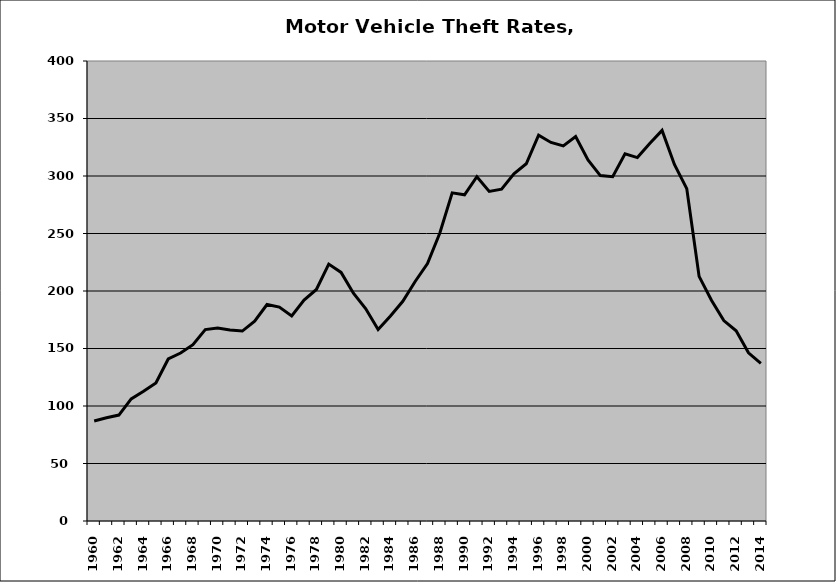
| Category | Motor Vehicle |
|---|---|
| 1960.0 | 86.937 |
| 1961.0 | 89.792 |
| 1962.0 | 92.116 |
| 1963.0 | 106.134 |
| 1964.0 | 112.819 |
| 1965.0 | 119.984 |
| 1966.0 | 140.88 |
| 1967.0 | 146.053 |
| 1968.0 | 153.32 |
| 1969.0 | 166.475 |
| 1970.0 | 167.806 |
| 1971.0 | 166.071 |
| 1972.0 | 165.171 |
| 1973.0 | 173.772 |
| 1974.0 | 188.271 |
| 1975.0 | 186.003 |
| 1976.0 | 178.278 |
| 1977.0 | 192.072 |
| 1978.0 | 201.327 |
| 1979.0 | 223.386 |
| 1980.0 | 216.149 |
| 1981.0 | 198.084 |
| 1982.0 | 184.499 |
| 1983.0 | 166.458 |
| 1984.0 | 178.264 |
| 1985.0 | 191.047 |
| 1986.0 | 208.277 |
| 1987.0 | 223.795 |
| 1988.0 | 250.383 |
| 1989.0 | 285.314 |
| 1990.0 | 283.663 |
| 1991.0 | 299.347 |
| 1992.0 | 286.614 |
| 1993.0 | 288.495 |
| 1994.0 | 301.867 |
| 1995.0 | 310.632 |
| 1996.0 | 335.464 |
| 1997.0 | 329.185 |
| 1998.0 | 326.213 |
| 1999.0 | 334.305 |
| 2000.0 | 313.89 |
| 2001.0 | 300.35 |
| 2002.0 | 299.38 |
| 2003.0 | 319.337 |
| 2004.0 | 316.001 |
| 2005.0 | 328.234 |
| 2006.0 | 339.649 |
| 2007.0 | 310.086 |
| 2008.0 | 288.998 |
| 2009.0 | 212.709 |
| 2010.0 | 192.02 |
| 2011.0 | 174.27 |
| 2012.0 | 165.361 |
| 2013.0 | 146.27 |
| 2014.0 | 137.068 |